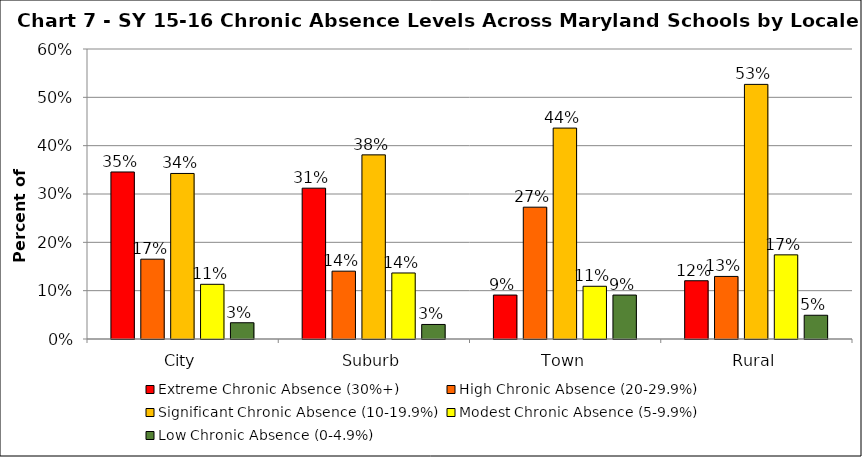
| Category | Extreme Chronic Absence (30%+) | High Chronic Absence (20-29.9%) | Significant Chronic Absence (10-19.9%) | Modest Chronic Absence (5-9.9%) | Low Chronic Absence (0-4.9%) |
|---|---|---|---|---|---|
| 0 | 0.346 | 0.165 | 0.343 | 0.113 | 0.034 |
| 1 | 0.312 | 0.14 | 0.381 | 0.137 | 0.03 |
| 2 | 0.091 | 0.273 | 0.436 | 0.109 | 0.091 |
| 3 | 0.121 | 0.129 | 0.527 | 0.174 | 0.049 |